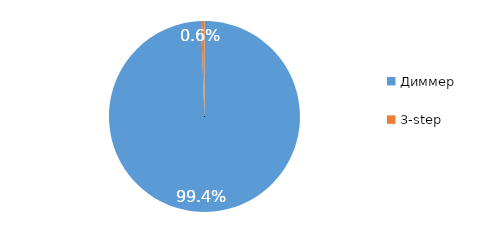
| Category | Series 0 |
|---|---|
| Диммер | 0.994 |
| 3-step | 0.006 |
| Не определено | 0 |